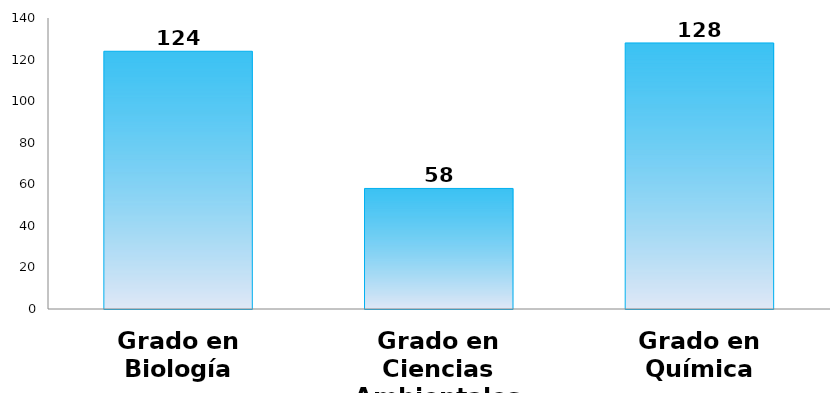
| Category | Series 0 |
|---|---|
| Grado en Biología | 124 |
| Grado en Ciencias Ambientales | 58 |
| Grado en Química | 128 |